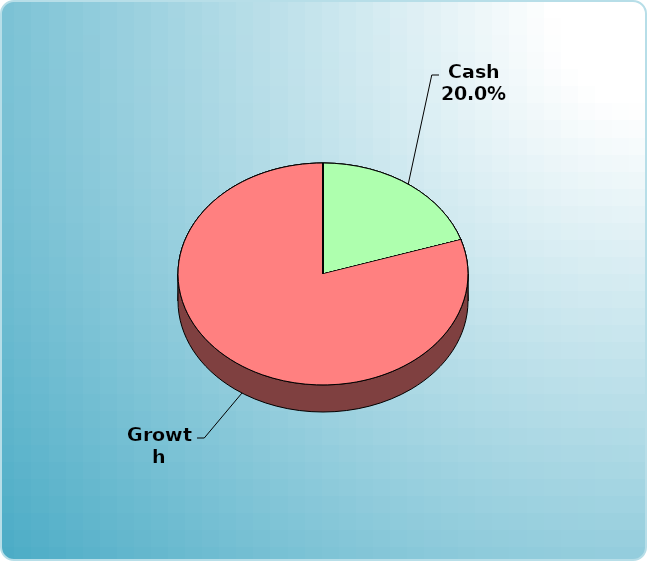
| Category | Series 0 |
|---|---|
| Cash | 5000 |
| Bonds | 0 |
| Muni Bond | 0 |
| Hybrid bond | 0 |
| Value | 0 |
| Growth | 20000 |
| Small-Cap | 0 |
| Tangibles | 0 |
| International | 0 |
| Personal Property | 0 |
| Miscellaneous | 0 |